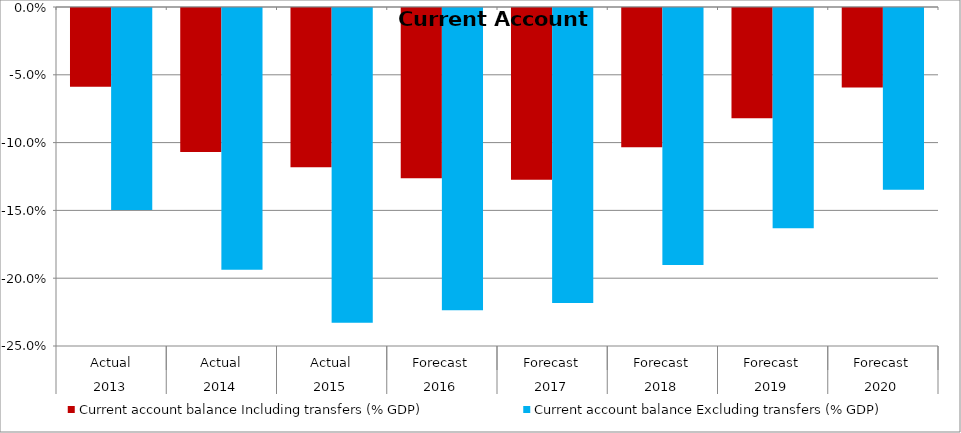
| Category | Current account balance Including transfers (% GDP) | Current account balance Excluding transfers (% GDP) |
|---|---|---|
| 0 | -0.058 | -0.149 |
| 1 | -0.106 | -0.193 |
| 2 | -0.117 | -0.232 |
| 3 | -0.126 | -0.223 |
| 4 | -0.127 | -0.218 |
| 5 | -0.103 | -0.189 |
| 6 | -0.081 | -0.162 |
| 7 | -0.059 | -0.134 |